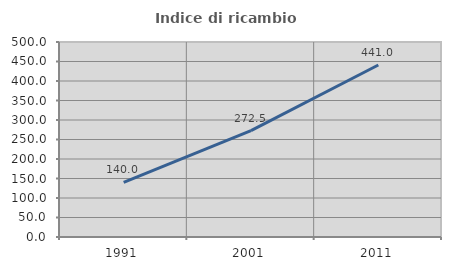
| Category | Indice di ricambio occupazionale  |
|---|---|
| 1991.0 | 140 |
| 2001.0 | 272.549 |
| 2011.0 | 441.026 |